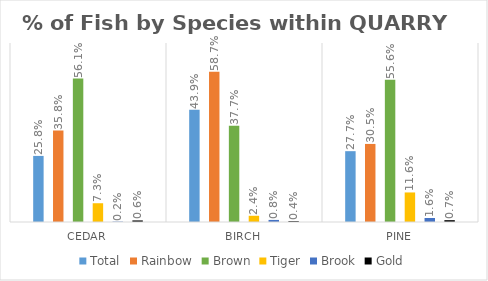
| Category | Total | Rainbow | Brown | Tiger | Brook | Gold |
|---|---|---|---|---|---|---|
| Cedar | 0.258 | 0.358 | 0.561 | 0.073 | 0.002 | 0.006 |
| Birch | 0.439 | 0.587 | 0.377 | 0.024 | 0.008 | 0.004 |
| Pine | 0.277 | 0.305 | 0.556 | 0.116 | 0.016 | 0.007 |